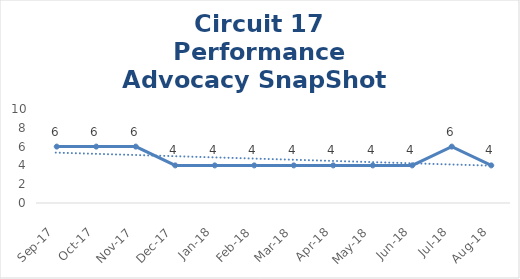
| Category | Circuit 17 |
|---|---|
| Sep-17 | 6 |
| Oct-17 | 6 |
| Nov-17 | 6 |
| Dec-17 | 4 |
| Jan-18 | 4 |
| Feb-18 | 4 |
| Mar-18 | 4 |
| Apr-18 | 4 |
| May-18 | 4 |
| Jun-18 | 4 |
| Jul-18 | 6 |
| Aug-18 | 4 |